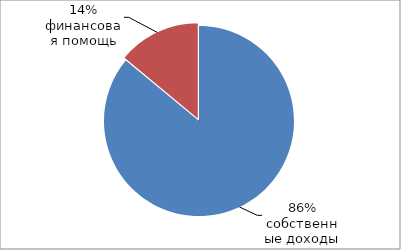
| Category | Series 0 |
|---|---|
| 0 | 0.86 |
| 1 | 0.14 |